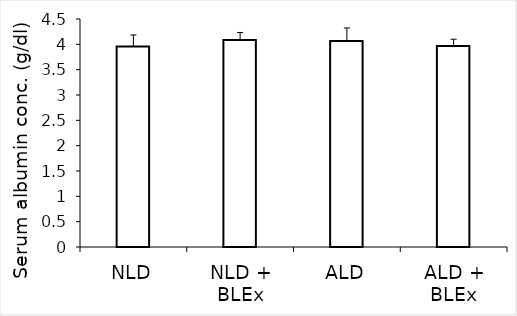
| Category | Series 0 |
|---|---|
| NLD | 3.955 |
| NLD + BLEx | 4.087 |
| ALD | 4.066 |
| ALD + BLEx | 3.965 |